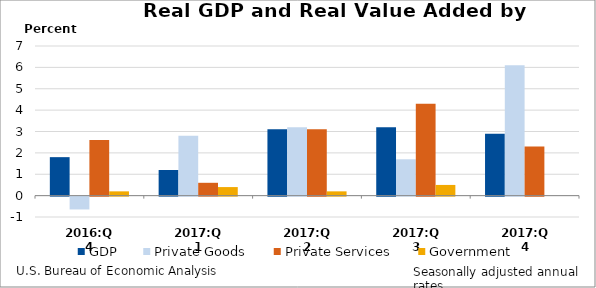
| Category | GDP | Private Goods | Private Services | Government |
|---|---|---|---|---|
| 2016:Q4 | 1.8 | -0.6 | 2.6 | 0.2 |
| 2017:Q1 | 1.2 | 2.8 | 0.6 | 0.4 |
| 2017:Q2 | 3.1 | 3.2 | 3.1 | 0.2 |
| 2017:Q3 | 3.2 | 1.7 | 4.3 | 0.5 |
| 2017:Q4 | 2.9 | 6.1 | 2.3 | 0 |